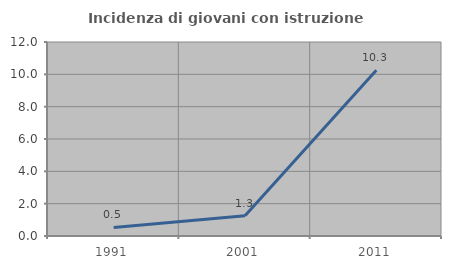
| Category | Incidenza di giovani con istruzione universitaria |
|---|---|
| 1991.0 | 0.526 |
| 2001.0 | 1.25 |
| 2011.0 | 10.256 |